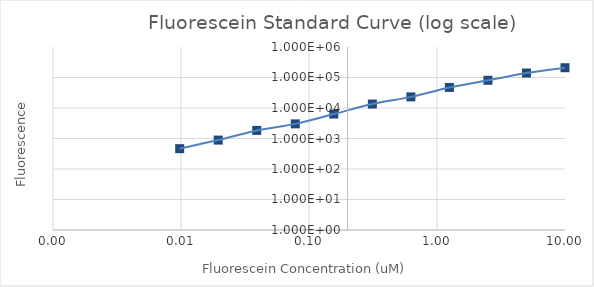
| Category | Series 1 |
|---|---|
| 10.0 | 209313.75 |
| 5.0 | 140341.25 |
| 2.5 | 81048.25 |
| 1.25 | 47156.5 |
| 0.625 | 23153.5 |
| 0.3125 | 13477.75 |
| 0.15625 | 6327 |
| 0.078125 | 3018.5 |
| 0.0390625 | 1841.25 |
| 0.01953125 | 887.5 |
| 0.009765625 | 463.5 |